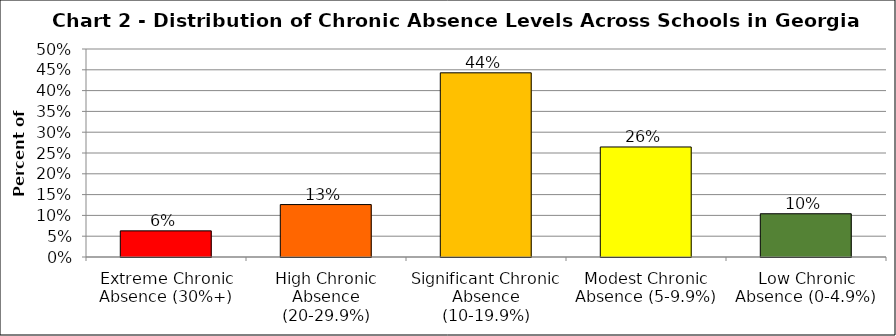
| Category | Series 1 |
|---|---|
| Extreme Chronic Absence (30%+) | 0.063 |
| High Chronic Absence (20-29.9%) | 0.126 |
| Significant Chronic Absence (10-19.9%) | 0.443 |
| Modest Chronic Absence (5-9.9%) | 0.264 |
| Low Chronic Absence (0-4.9%) | 0.104 |